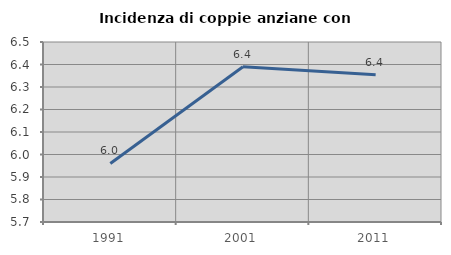
| Category | Incidenza di coppie anziane con figli |
|---|---|
| 1991.0 | 5.96 |
| 2001.0 | 6.39 |
| 2011.0 | 6.355 |